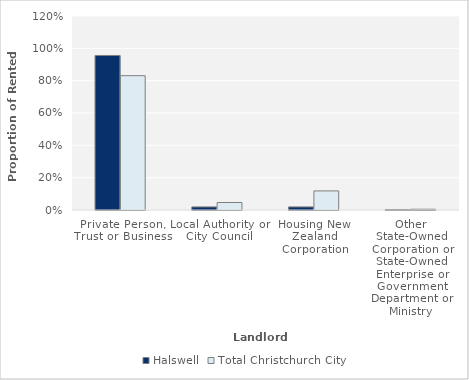
| Category | Halswell | Total Christchurch City |
|---|---|---|
| Private Person, Trust or Business | 0.956 | 0.831 |
| Local Authority or City Council | 0.019 | 0.046 |
| Housing New Zealand Corporation | 0.019 | 0.118 |
| Other State-Owned Corporation or State-Owned Enterprise or Government Department or Ministry | 0.003 | 0.005 |